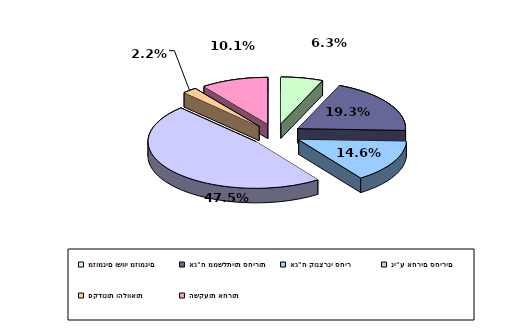
| Category | Series 0 |
|---|---|
| מזומנים ושווי מזומנים | 0.063 |
| אג"ח ממשלתיות סחירות | 0.193 |
| אג"ח קונצרני סחיר | 0.146 |
| ני"ע אחרים סחירים | 0.475 |
| פקדונות והלוואות | 0.022 |
| השקעות אחרות | 0.101 |